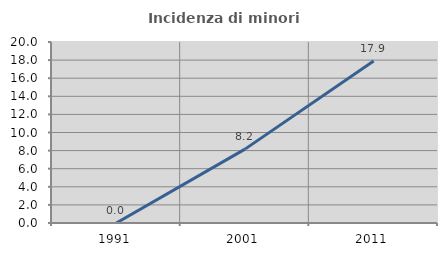
| Category | Incidenza di minori stranieri |
|---|---|
| 1991.0 | 0 |
| 2001.0 | 8.163 |
| 2011.0 | 17.897 |